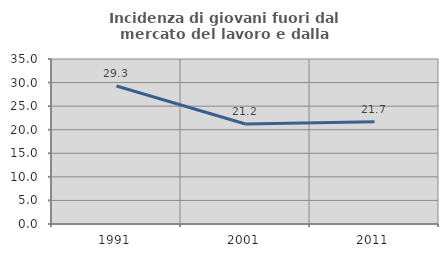
| Category | Incidenza di giovani fuori dal mercato del lavoro e dalla formazione  |
|---|---|
| 1991.0 | 29.26 |
| 2001.0 | 21.222 |
| 2011.0 | 21.684 |